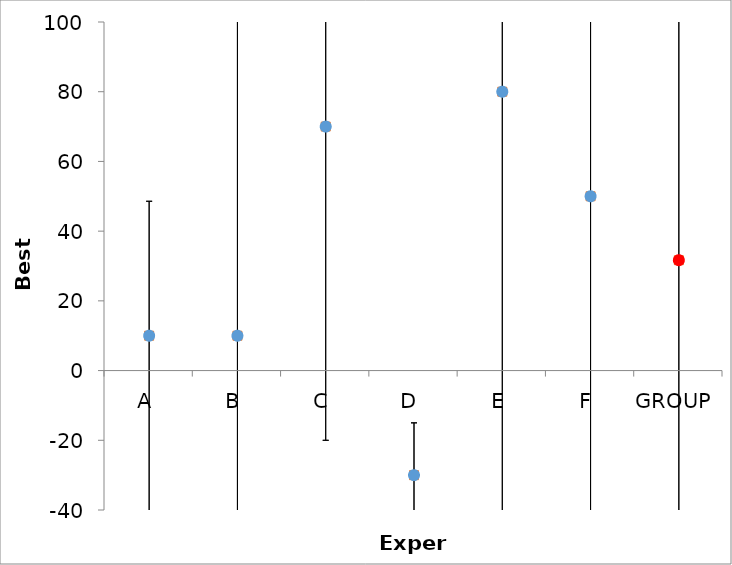
| Category | Series 1 | Series 0 |
|---|---|---|
| A | 10 | 10 |
| B | 10 | 10 |
| C | 70 | 70 |
| D | -30 | -30 |
| E | 80 | 80 |
| F | 50 | 50 |
| GROUP | 31.667 | 31.667 |